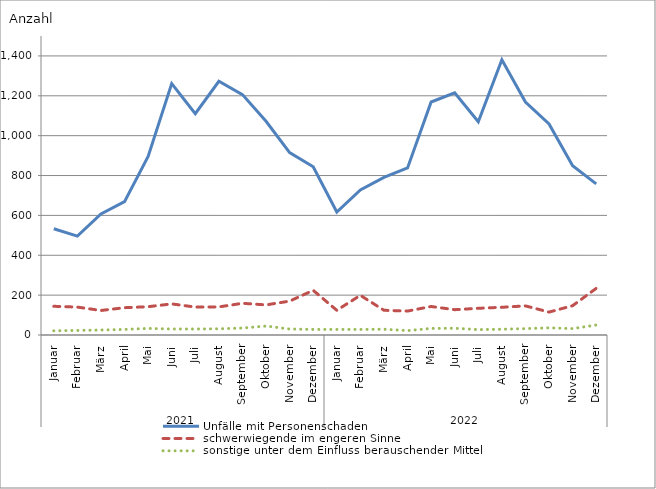
| Category | Unfälle mit Personenschaden | schwerwiegende im engeren Sinne | sonstige unter dem Einfluss berauschender Mittel |
|---|---|---|---|
| 0 | 533 | 144 | 21 |
| 1 | 496 | 140 | 23 |
| 2 | 607 | 123 | 25 |
| 3 | 669 | 137 | 28 |
| 4 | 896 | 142 | 33 |
| 5 | 1261 | 156 | 30 |
| 6 | 1110 | 140 | 30 |
| 7 | 1273 | 141 | 31 |
| 8 | 1206 | 159 | 35 |
| 9 | 1072 | 151 | 45 |
| 10 | 915 | 170 | 30 |
| 11 | 844 | 224 | 28 |
| 12 | 617 | 124 | 28 |
| 13 | 728 | 199 | 28 |
| 14 | 791 | 124 | 29 |
| 15 | 838 | 120 | 22 |
| 16 | 1169 | 143 | 33 |
| 17 | 1215 | 127 | 34 |
| 18 | 1070 | 134 | 27 |
| 19 | 1381 | 139 | 29 |
| 20 | 1169 | 146 | 32 |
| 21 | 1059 | 115 | 36 |
| 22 | 849 | 147 | 32 |
| 23 | 758 | 234 | 50 |